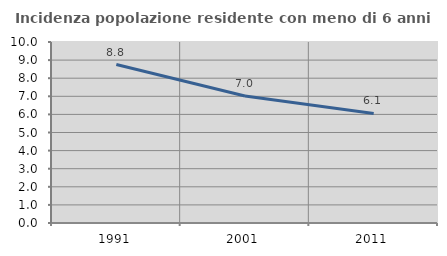
| Category | Incidenza popolazione residente con meno di 6 anni |
|---|---|
| 1991.0 | 8.753 |
| 2001.0 | 7.014 |
| 2011.0 | 6.051 |